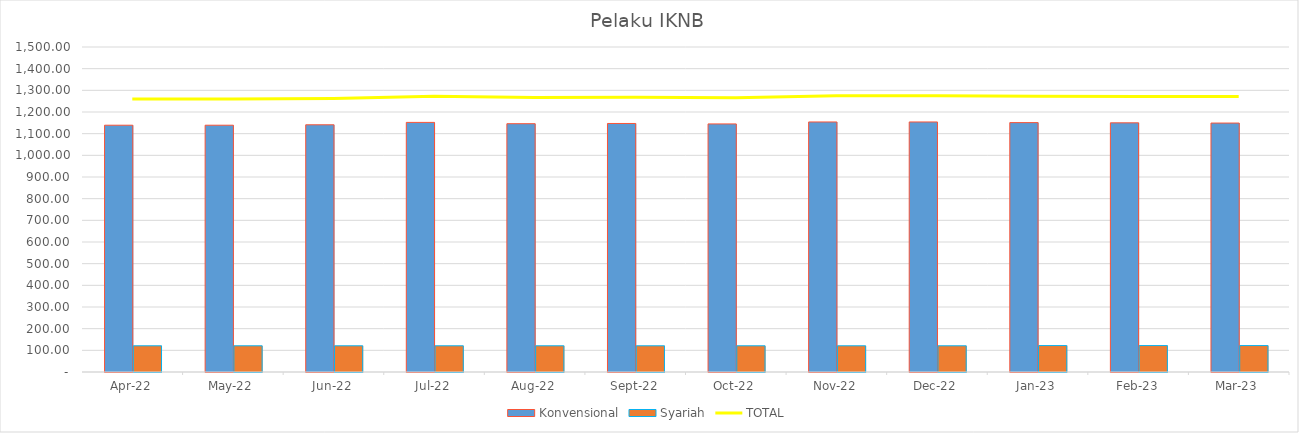
| Category |  Konvensional  |  Syariah  |
|---|---|---|
| 2022-04-01 | 1139 | 121 |
| 2022-05-01 | 1139 | 121 |
| 2022-06-01 | 1141 | 121 |
| 2022-07-01 | 1152 | 121 |
| 2022-08-01 | 1146 | 121 |
| 2022-09-01 | 1147 | 121 |
| 2022-10-01 | 1145 | 121 |
| 2022-11-01 | 1154 | 121 |
| 2022-12-01 | 1154 | 121 |
| 2023-01-01 | 1151 | 122 |
| 2023-02-01 | 1150 | 122 |
| 2023-03-01 | 1149 | 122 |